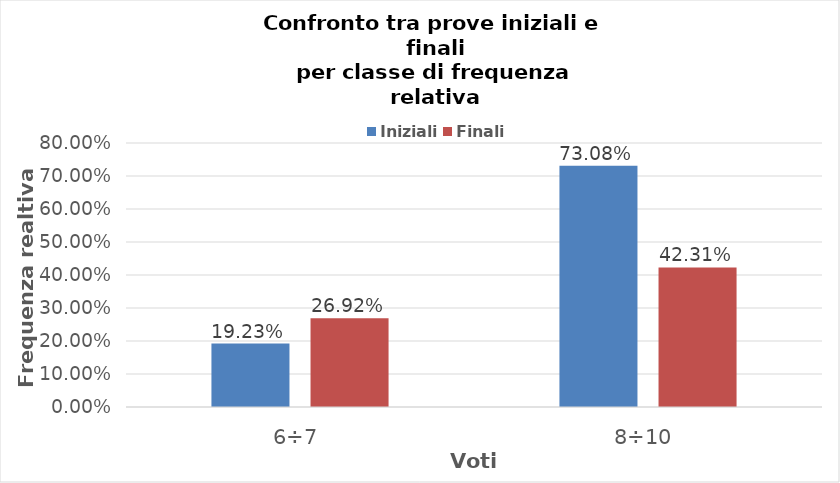
| Category | Iniziali | Finali |
|---|---|---|
| 6÷7 | 0.192 | 0.269 |
| 8÷10 | 0.731 | 0.423 |